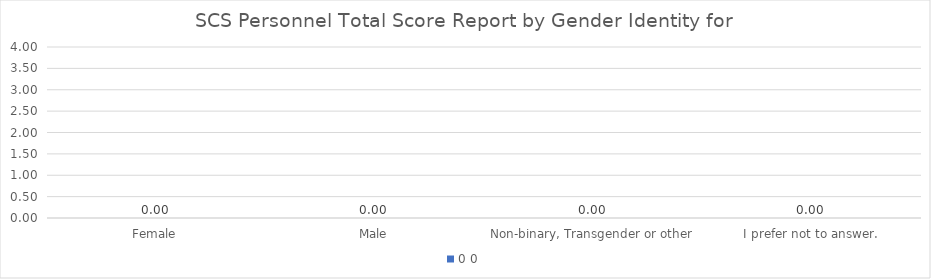
| Category | 0 |
|---|---|
| Female | 0 |
| Male | 0 |
| Non-binary, Transgender or other | 0 |
| I prefer not to answer. | 0 |